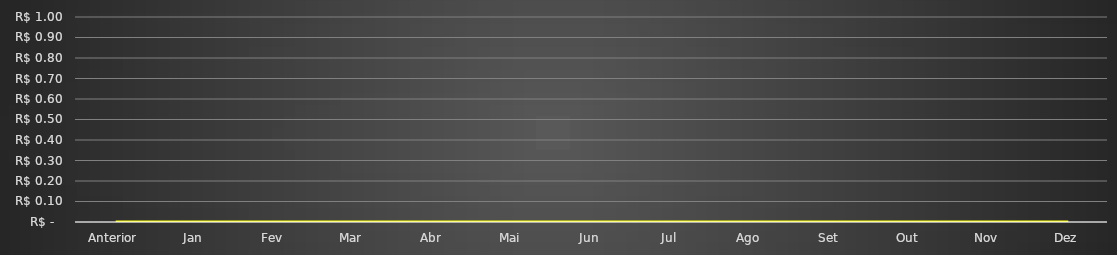
| Category | Series 0 |
|---|---|
| Anterior | 0 |
| Jan | 0 |
| Fev | 0 |
| Mar | 0 |
| Abr | 0 |
| Mai | 0 |
| Jun | 0 |
| Jul | 0 |
| Ago | 0 |
| Set | 0 |
| Out | 0 |
| Nov | 0 |
| Dez | 0 |